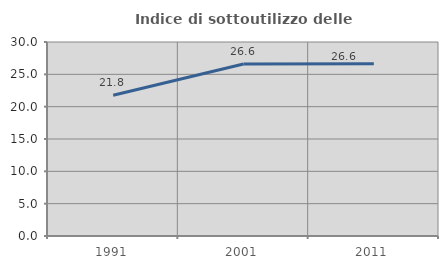
| Category | Indice di sottoutilizzo delle abitazioni  |
|---|---|
| 1991.0 | 21.766 |
| 2001.0 | 26.592 |
| 2011.0 | 26.636 |